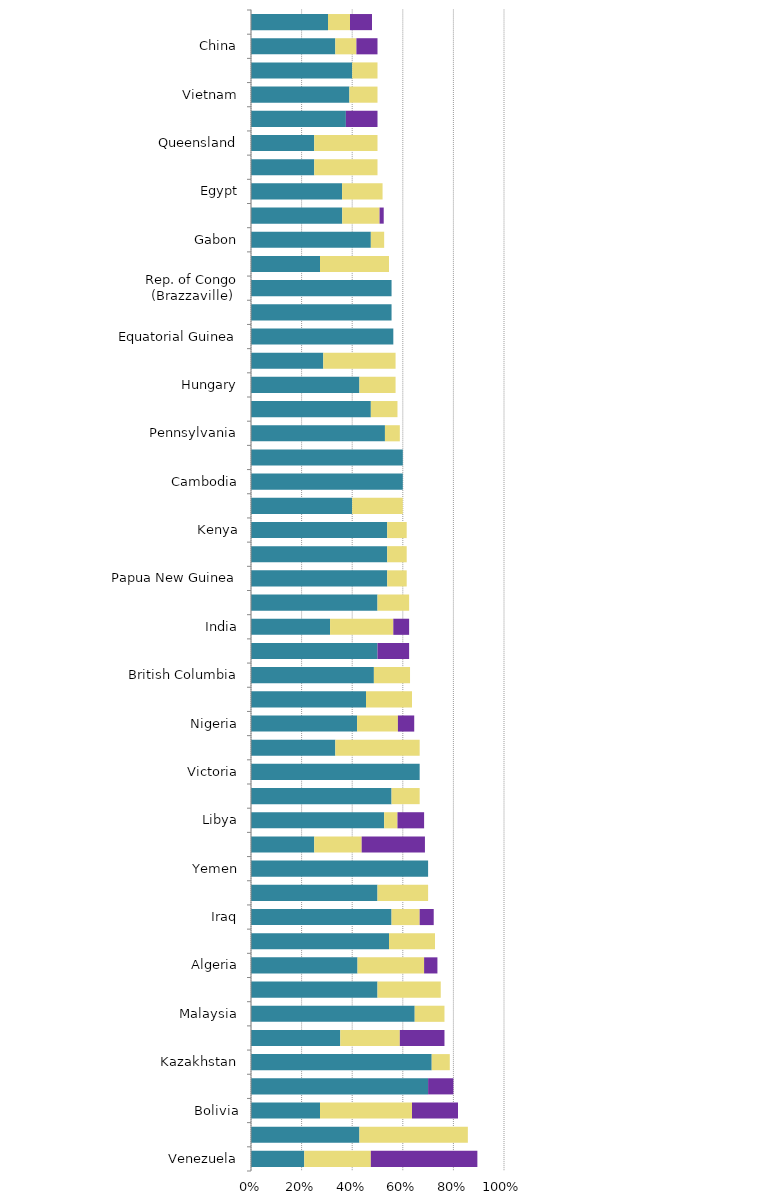
| Category | Mild deterrent to investment | Strong deterrent to investment | Would not pursue investment due to this factor |
|---|---|---|---|
| Venezuela | 0.211 | 0.263 | 0.421 |
| Indonesia | 0.429 | 0.429 | 0 |
| Bolivia | 0.273 | 0.364 | 0.182 |
| Trinidad and Tobago | 0.7 | 0 | 0.1 |
| Kazakhstan | 0.714 | 0.071 | 0 |
| California | 0.353 | 0.235 | 0.176 |
| Malaysia | 0.647 | 0.118 | 0 |
| Uganda | 0.5 | 0.25 | 0 |
| Algeria | 0.421 | 0.263 | 0.053 |
| Bangladesh | 0.545 | 0.182 | 0 |
| Iraq | 0.556 | 0.111 | 0.056 |
| Angola | 0.5 | 0.2 | 0 |
| Yemen | 0.7 | 0 | 0 |
| Ecuador | 0.25 | 0.188 | 0.25 |
| Libya | 0.526 | 0.053 | 0.105 |
| Norway – Other Offshore (ex. Nth. Sea) | 0.556 | 0.111 | 0 |
| Victoria | 0.667 | 0 | 0 |
| Kuwait | 0.333 | 0.333 | 0 |
| Nigeria | 0.419 | 0.161 | 0.065 |
| Brazil – Offshore presalt PSCs | 0.455 | 0.182 | 0 |
| British Columbia | 0.486 | 0.143 | 0 |
| Nova Scotia | 0.5 | 0 | 0.125 |
| India | 0.312 | 0.25 | 0.062 |
| Brazil – Onshore CCs | 0.5 | 0.125 | 0 |
| Papua New Guinea | 0.538 | 0.077 | 0 |
| Myanmar | 0.538 | 0.077 | 0 |
| Kenya | 0.538 | 0.077 | 0 |
| South Africa | 0.4 | 0.2 | 0 |
| Cambodia | 0.6 | 0 | 0 |
| Ivory Coast | 0.6 | 0 | 0 |
| Pennsylvania | 0.529 | 0.059 | 0 |
| Brazil – Offshore CCs | 0.474 | 0.105 | 0 |
| Hungary | 0.429 | 0.143 | 0 |
| Argentina – Santa Cruz | 0.286 | 0.286 | 0 |
| Equatorial Guinea | 0.562 | 0 | 0 |
| Brunei | 0.556 | 0 | 0 |
| Rep. of Congo (Brazzaville) | 0.556 | 0 | 0 |
| France | 0.273 | 0.273 | 0 |
| Gabon | 0.474 | 0.053 | 0 |
| Alberta | 0.361 | 0.148 | 0.016 |
| Egypt | 0.36 | 0.16 | 0 |
| Illinois | 0.25 | 0.25 | 0 |
| Queensland | 0.25 | 0.25 | 0 |
| Spain – Onshore | 0.375 | 0 | 0.125 |
| Vietnam | 0.389 | 0.111 | 0 |
| Morocco | 0.4 | 0.1 | 0 |
| China | 0.333 | 0.083 | 0.083 |
| Mexico | 0.304 | 0.087 | 0.087 |